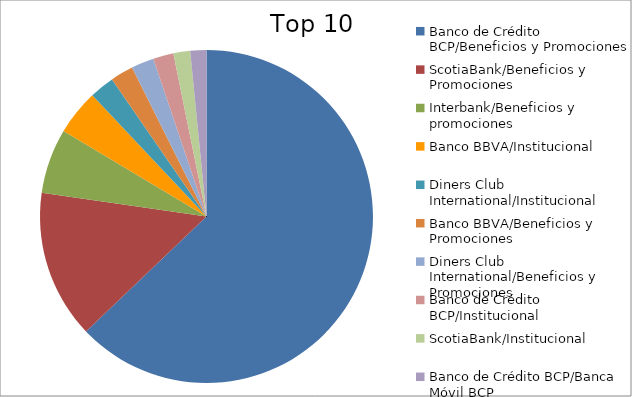
| Category | Series 0 |
|---|---|
| Banco de Crédito BCP/Beneficios y Promociones | 57.87 |
| ScotiaBank/Beneficios y Promociones | 13.25 |
| Interbank/Beneficios y promociones | 5.79 |
| Banco BBVA/Institucional | 4.05 |
| Diners Club International/Institucional | 2.23 |
| Banco BBVA/Beneficios y Promociones | 2.05 |
| Diners Club International/Beneficios y Promociones | 2.03 |
| Banco de Crédito BCP/Institucional | 1.82 |
| ScotiaBank/Institucional | 1.5 |
| Banco de Crédito BCP/Banca Móvil BCP | 1.44 |